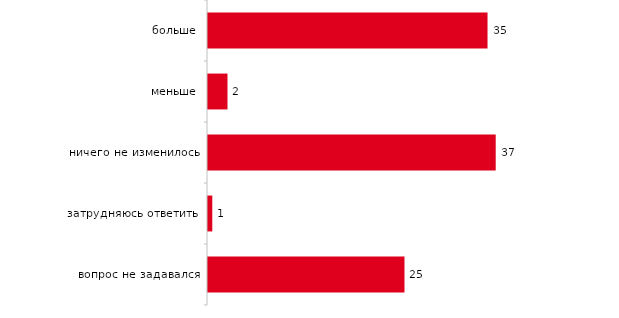
| Category | Series 0 |
|---|---|
| больше | 35.495 |
| меньше | 2.475 |
| ничего не изменилось | 36.535 |
| затрудняюсь ответить | 0.545 |
| вопрос не задавался | 24.95 |